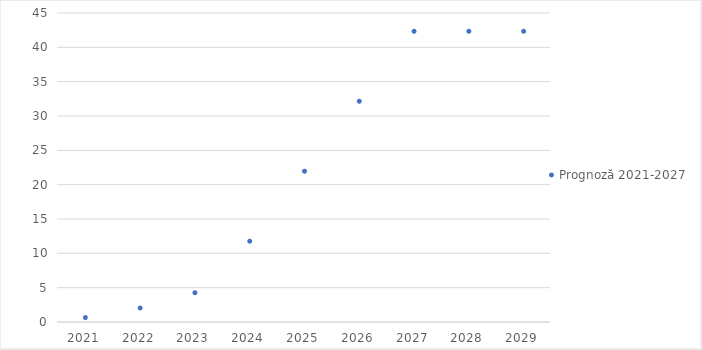
| Category | Prognoză 2021-2027 |
|---|---|
| 2021.0 | 0.649 |
| 2022.0 | 2.038 |
| 2023.0 | 4.262 |
| 2024.0 | 11.766 |
| 2025.0 | 21.957 |
| 2026.0 | 32.148 |
| 2027.0 | 42.339 |
| 2028.0 | 42.339 |
| 2029.0 | 42.339 |